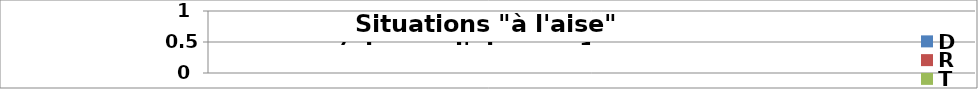
| Category | D | R | T | O |
|---|---|---|---|---|
| 1-2 | 0 | 0 | 0 | 0 |